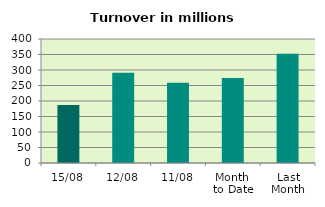
| Category | Series 0 |
|---|---|
| 15/08 | 187.34 |
| 12/08 | 291.397 |
| 11/08 | 258.672 |
| Month 
to Date | 273.809 |
| Last
Month | 352.063 |